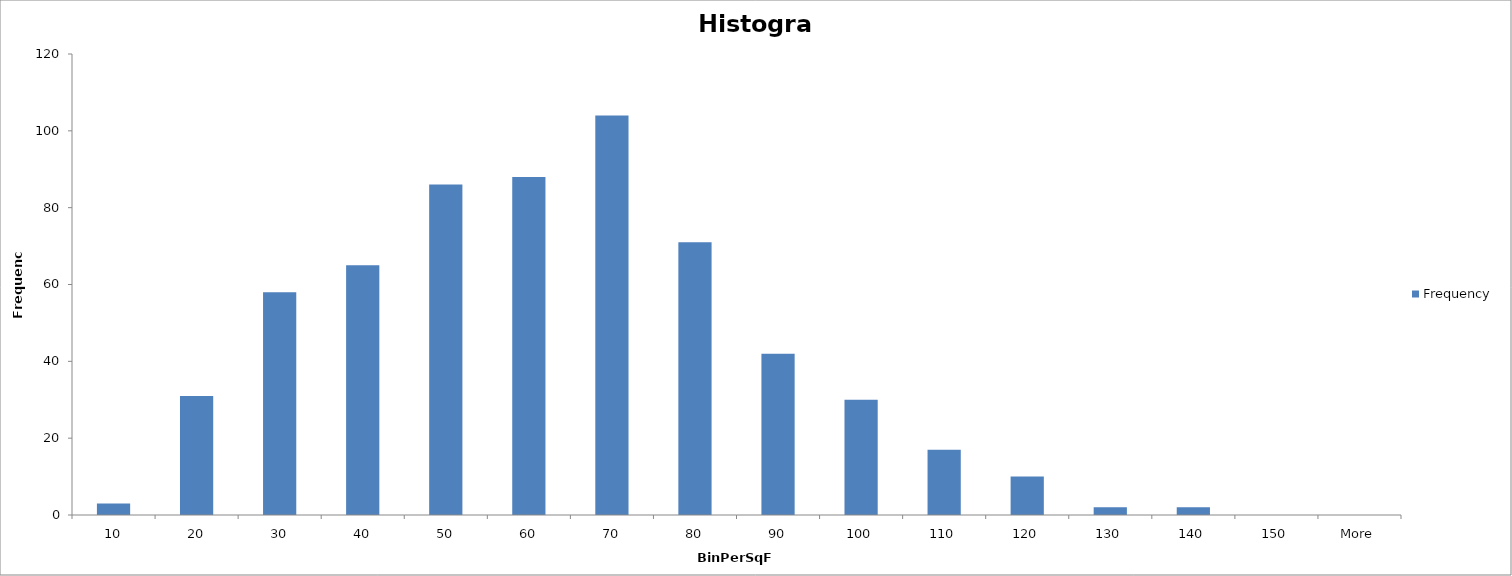
| Category | Frequency |
|---|---|
| 10 | 3 |
| 20 | 31 |
| 30 | 58 |
| 40 | 65 |
| 50 | 86 |
| 60 | 88 |
| 70 | 104 |
| 80 | 71 |
| 90 | 42 |
| 100 | 30 |
| 110 | 17 |
| 120 | 10 |
| 130 | 2 |
| 140 | 2 |
| 150 | 0 |
| More | 0 |